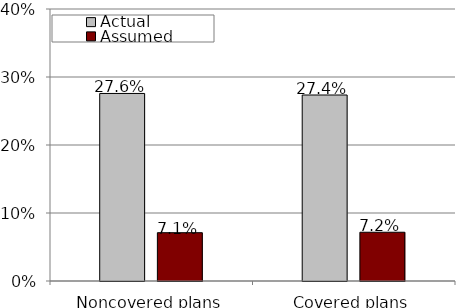
| Category | Actual | Assumed |
|---|---|---|
| Noncovered plans | 0.276 | 0.071 |
| Covered plans | 0.274 | 0.072 |